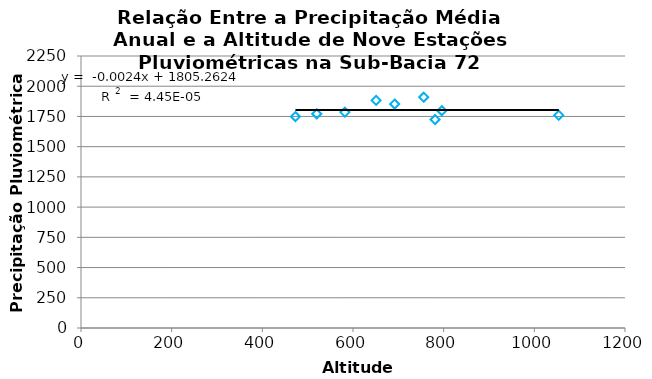
| Category | Series 0 |
|---|---|
| 651.0 | 1882.56 |
| 1054.0 | 1759.855 |
| 582.0 | 1785.49 |
| 781.0 | 1724.323 |
| 692.0 | 1852.398 |
| 796.0 | 1797.327 |
| 473.0 | 1749.327 |
| 756.0 | 1909.372 |
| 520.0 | 1771.406 |